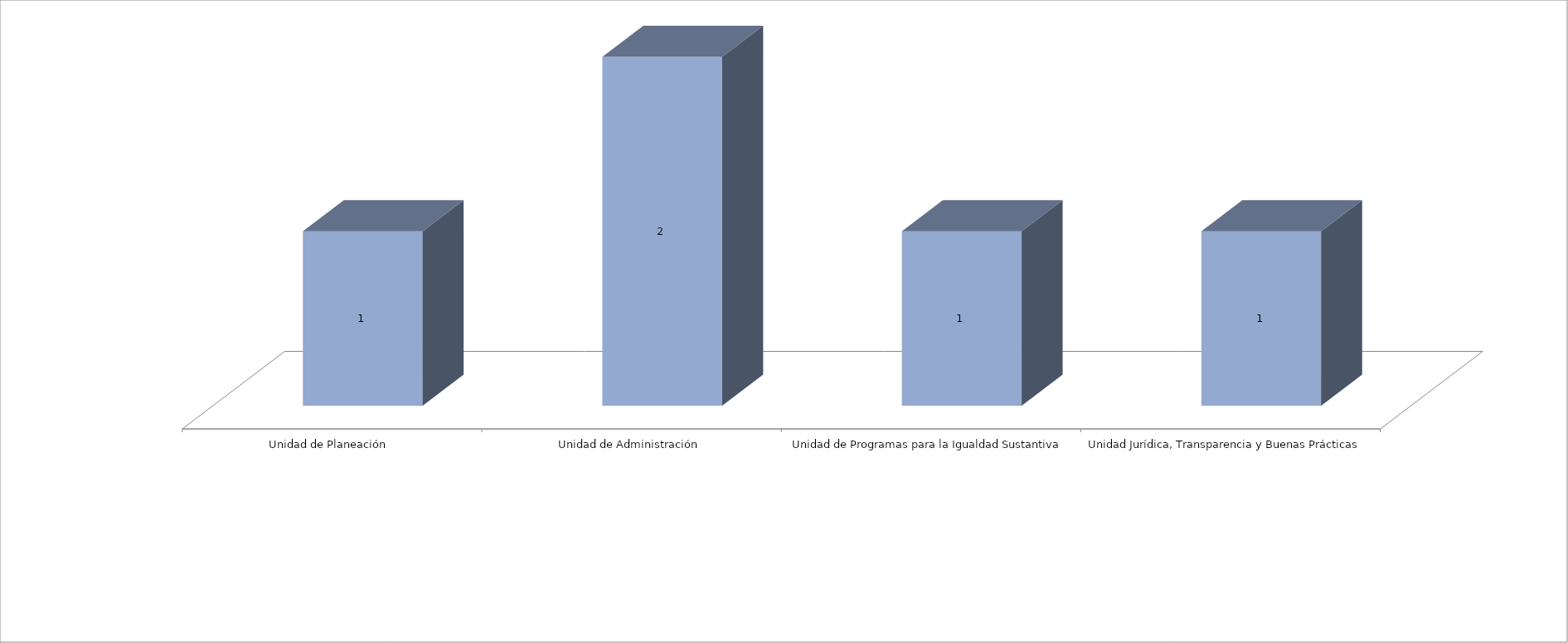
| Category | Series 0 | Series 1 |
|---|---|---|
| Unidad de Planeación  |  | 1 |
| Unidad de Administración |  | 2 |
| Unidad de Programas para la Igualdad Sustantiva |  | 1 |
| Unidad Jurídica, Transparencia y Buenas Prácticas  |  | 1 |